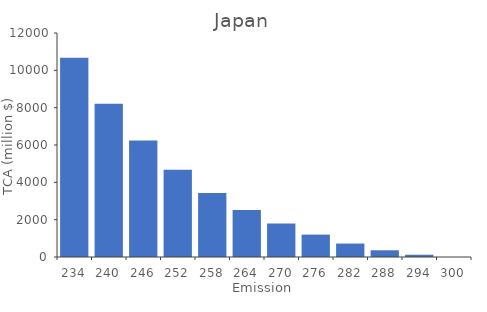
| Category | TCA (million $) |
|---|---|
| 234.0 | 10680 |
| 240.0 | 8210 |
| 246.0 | 6240 |
| 252.0 | 4680 |
| 258.0 | 3430 |
| 264.0 | 2520 |
| 270.0 | 1800 |
| 276.0 | 1200 |
| 282.0 | 720 |
| 288.0 | 360 |
| 294.0 | 120 |
| 300.0 | 0 |